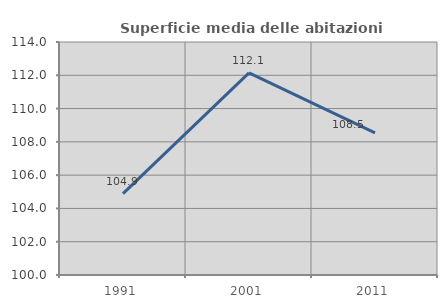
| Category | Superficie media delle abitazioni occupate |
|---|---|
| 1991.0 | 104.893 |
| 2001.0 | 112.141 |
| 2011.0 | 108.537 |